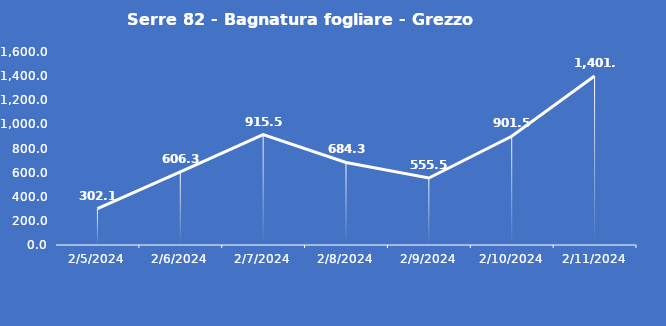
| Category | Serre 82 - Bagnatura fogliare - Grezzo (min) |
|---|---|
| 2/5/24 | 302.1 |
| 2/6/24 | 606.3 |
| 2/7/24 | 915.5 |
| 2/8/24 | 684.3 |
| 2/9/24 | 555.5 |
| 2/10/24 | 901.5 |
| 2/11/24 | 1401.3 |